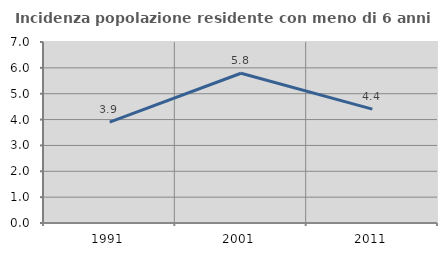
| Category | Incidenza popolazione residente con meno di 6 anni |
|---|---|
| 1991.0 | 3.905 |
| 2001.0 | 5.791 |
| 2011.0 | 4.405 |